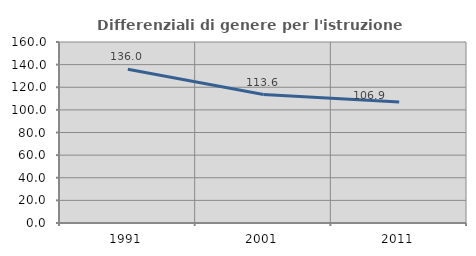
| Category | Differenziali di genere per l'istruzione superiore |
|---|---|
| 1991.0 | 135.962 |
| 2001.0 | 113.558 |
| 2011.0 | 106.945 |